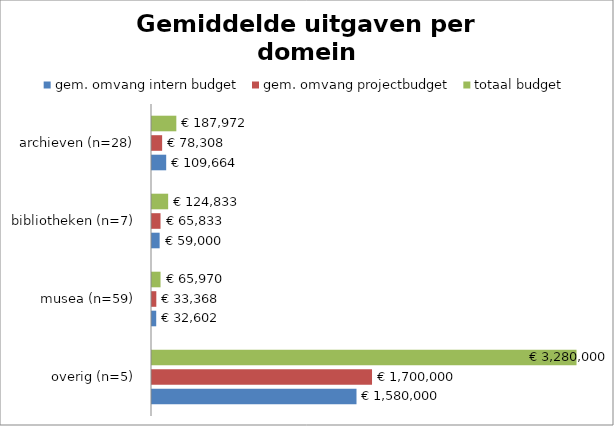
| Category | gem. omvang intern budget | gem. omvang projectbudget | totaal budget |
|---|---|---|---|
| overig (n=5) | 1580000 | 1700000 | 3280000 |
| musea (n=59) | 32601.983 | 33368.421 | 65970.404 |
| bibliotheken (n=7) | 59000 | 65833.333 | 124833.333 |
| archieven (n=28) | 109664.286 | 78307.692 | 187971.978 |